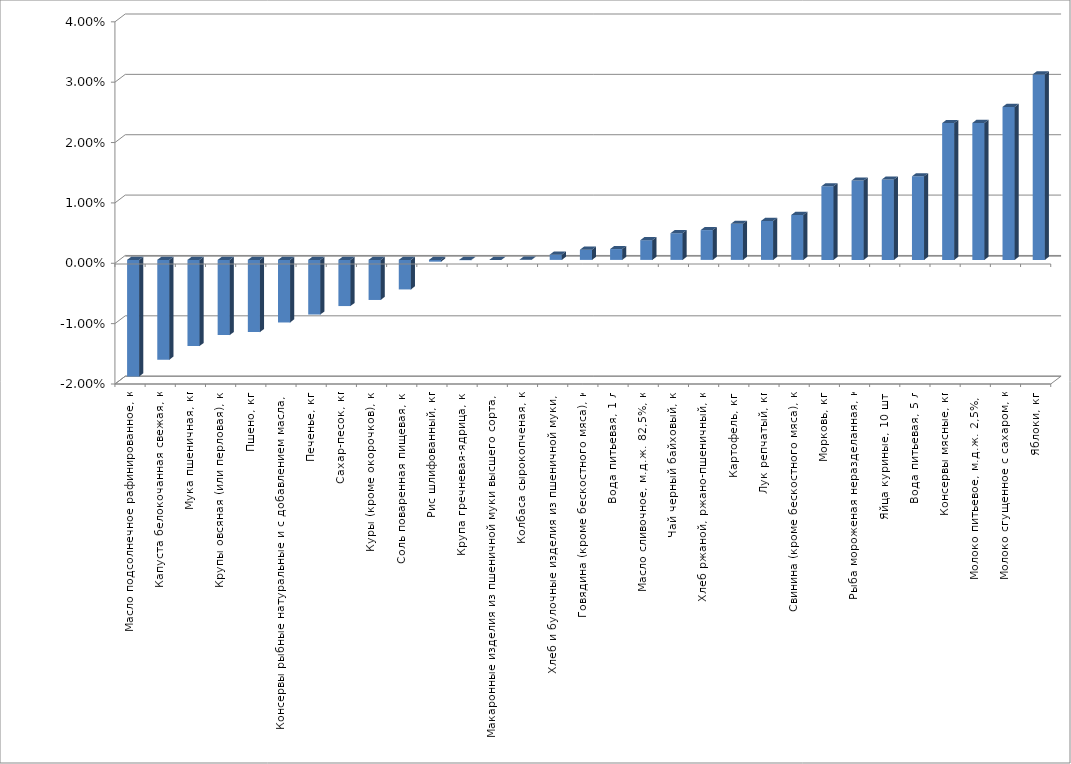
| Category | Series 0 |
|---|---|
| Масло подсолнечное рафинированное, кг | -0.019 |
| Капуста белокочанная свежая, кг | -0.017 |
| Мука пшеничная, кг | -0.014 |
| Крупы овсяная (или перловая), кг | -0.012 |
| Пшено, кг | -0.012 |
| Консервы рыбные натуральные и с добавлением масла, кг | -0.01 |
| Печенье, кг | -0.009 |
| Сахар-песок, кг | -0.008 |
| Куры (кроме окорочков), кг | -0.007 |
| Соль поваренная пищевая, кг | -0.005 |
| Рис шлифованный, кг | 0 |
| Крупа гречневая-ядрица, кг | 0 |
| Макаронные изделия из пшеничной муки высшего сорта, кг | 0 |
| Колбаса сырокопченая, кг | 0 |
| Хлеб и булочные изделия из пшеничной муки, кг | 0.001 |
| Говядина (кроме бескостного мяса), кг | 0.002 |
| Вода питьевая, 1 л | 0.002 |
| Масло сливочное, м.д.ж. 82,5%, кг | 0.003 |
| Чай черный байховый, кг | 0.004 |
| Хлеб ржаной, ржано-пшеничный, кг | 0.005 |
| Картофель, кг | 0.006 |
| Лук репчатый, кг | 0.006 |
| Свинина (кроме бескостного мяса), кг | 0.007 |
| Морковь, кг | 0.012 |
| Рыба мороженая неразделанная, кг | 0.013 |
| Яйца куриные, 10 шт. | 0.013 |
| Вода питьевая, 5 л | 0.014 |
| Консервы мясные, кг | 0.023 |
| Молоко питьевое, м.д.ж. 2,5%, л | 0.023 |
| Молоко сгущенное с сахаром, кг | 0.025 |
| Яблоки, кг | 0.031 |